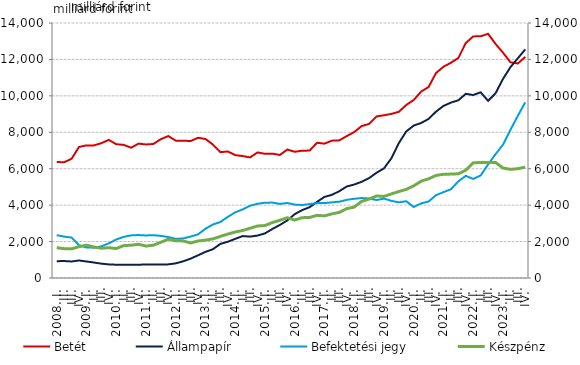
| Category | Betét | Állampapír |
|---|---|---|
| 2008. I. | 6369.078 | 923.097 |
| II. | 6353.118 | 931.39 |
| III. | 6545.865 | 906.504 |
| IV. | 7195.751 | 962.149 |
| 2009. I. | 7279.039 | 905.838 |
|          II. | 7280.739 | 850.708 |
|          III. | 7401.98 | 786.905 |
|          IV. | 7581.462 | 746.744 |
| 2010. I. | 7344.556 | 729.781 |
|          II. | 7309.284 | 723.671 |
|          III. | 7151.434 | 720.547 |
|          IV. | 7376.127 | 729.849 |
| 2011. I. | 7331.236 | 741.081 |
|          II. | 7357.487 | 735.56 |
|          III. | 7620.95 | 738.711 |
|          IV. | 7792.493 | 748.232 |
| 2012. I. | 7541.756 | 802.887 |
|          II. | 7538.73 | 915.513 |
|          III. | 7518.398 | 1061.912 |
|          IV. | 7697.379 | 1245.713 |
| 2013. I. | 7631.341 | 1436.118 |
| II. | 7325.034 | 1579.732 |
|          III. | 6907.43 | 1871.773 |
| IV. | 6946.278 | 1990.515 |
| 2014. I. | 6748.188 | 2148.923 |
| II. | 6694.451 | 2301.95 |
|          III. | 6621.693 | 2270.877 |
| IV. | 6892.237 | 2329.773 |
| 2015. I. | 6818.008 | 2449.915 |
| II. | 6826.452 | 2691.503 |
|          III. | 6754.516 | 2910.544 |
| IV. | 7051.513 | 3159.8 |
| 2016. I. | 6930.932 | 3506.213 |
| II. | 6991.037 | 3726.482 |
|          III. | 6994.031 | 3888.133 |
| IV. | 7424.79 | 4178.84 |
| 2017. I. | 7377.157 | 4451.344 |
| II. | 7541.027 | 4565.608 |
|          III. | 7554.234 | 4767.429 |
| IV. | 7791.066 | 5024.922 |
| 2018. I. | 8012.701 | 5131.929 |
| II. | 8341.826 | 5281.653 |
|          III. | 8458.359 | 5484.123 |
| IV. | 8868.953 | 5778.729 |
| 2019. I. | 8934.014 | 6017.98 |
| II. | 9008.278 | 6572.216 |
|          III. | 9125.526 | 7407.438 |
| IV. | 9499.629 | 8047.086 |
| 2020. I. | 9772.197 | 8369.14 |
| II. | 10235.749 | 8510.235 |
|          III. | 10486.847 | 8733.518 |
| IV. | 11255.255 | 9135.601 |
| 2021. I. | 11596.913 | 9446.905 |
| II. | 11817.469 | 9629.955 |
|          III. | 12080.462 | 9757.916 |
| IV. | 12899.115 | 10110.003 |
| 2022. I. | 13264.434 | 10045.567 |
| II. | 13268.665 | 10196.268 |
|          III. | 13407.094 | 9729.02 |
| IV. | 12850.828 | 10140.231 |
| 2023. I. | 12374.025 | 10927.553 |
| II. | 11845.642 | 11573.326 |
|          III. | 11777.203 | 12062.158 |
| IV. | 12138.611 | 12554.129 |